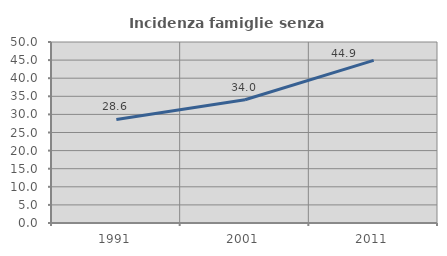
| Category | Incidenza famiglie senza nuclei |
|---|---|
| 1991.0 | 28.594 |
| 2001.0 | 34.043 |
| 2011.0 | 44.914 |